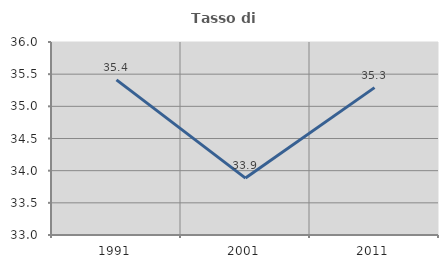
| Category | Tasso di occupazione   |
|---|---|
| 1991.0 | 35.411 |
| 2001.0 | 33.885 |
| 2011.0 | 35.291 |